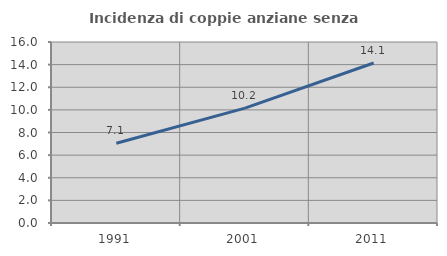
| Category | Incidenza di coppie anziane senza figli  |
|---|---|
| 1991.0 | 7.055 |
| 2001.0 | 10.155 |
| 2011.0 | 14.146 |